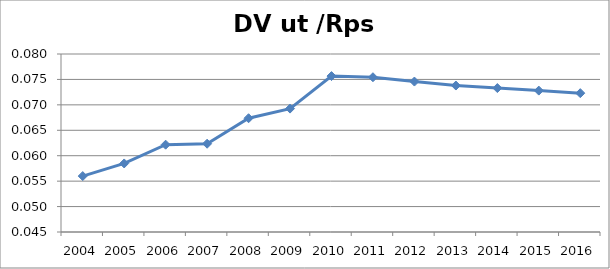
| Category | DV ut /Rps in |
|---|---|
| 2004.0 | 0.056 |
| 2005.0 | 0.058 |
| 2006.0 | 0.062 |
| 2007.0 | 0.062 |
| 2008.0 | 0.067 |
| 2009.0 | 0.069 |
| 2010.0 | 0.076 |
| 2011.0 | 0.075 |
| 2012.0 | 0.075 |
| 2013.0 | 0.074 |
| 2014.0 | 0.073 |
| 2015.0 | 0.073 |
| 2016.0 | 0.072 |